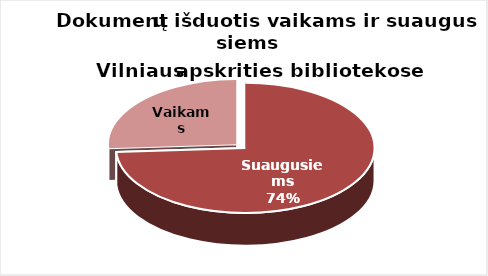
| Category | Series 0 |
|---|---|
| Suaugusiems | 1866596 |
| Vaikams | 656686 |